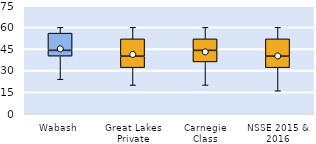
| Category | 25th | 50th | 75th |
|---|---|---|---|
| Wabash | 40 | 4 | 12 |
| Great Lakes Private | 32 | 8 | 12 |
| Carnegie Class | 36 | 8 | 8 |
| NSSE 2015 & 2016 | 32 | 8 | 12 |